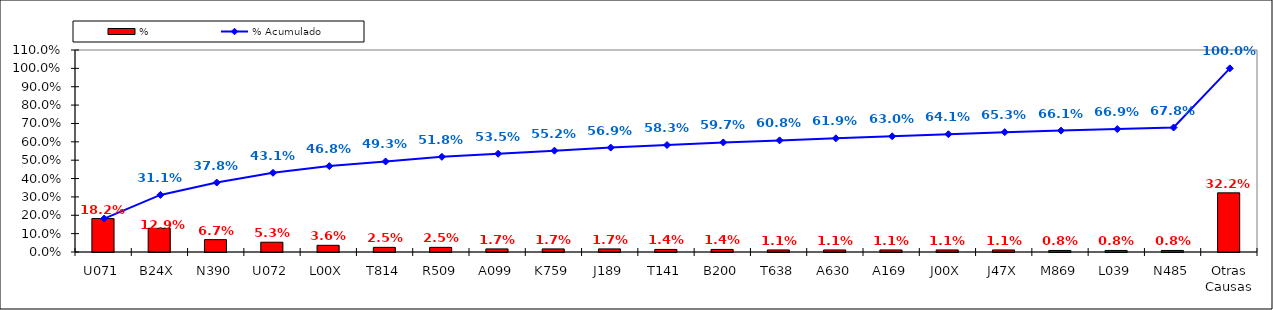
| Category | % |
|---|---|
| U071 | 0.182 |
| B24X | 0.129 |
| N390 | 0.067 |
| U072 | 0.053 |
| L00X | 0.036 |
| T814 | 0.025 |
| R509 | 0.025 |
| A099 | 0.017 |
| K759 | 0.017 |
| J189 | 0.017 |
| T141 | 0.014 |
| B200 | 0.014 |
| T638 | 0.011 |
| A630 | 0.011 |
| A169 | 0.011 |
| J00X | 0.011 |
| J47X | 0.011 |
| M869 | 0.008 |
| L039 | 0.008 |
| N485 | 0.008 |
| Otras Causas | 0.322 |